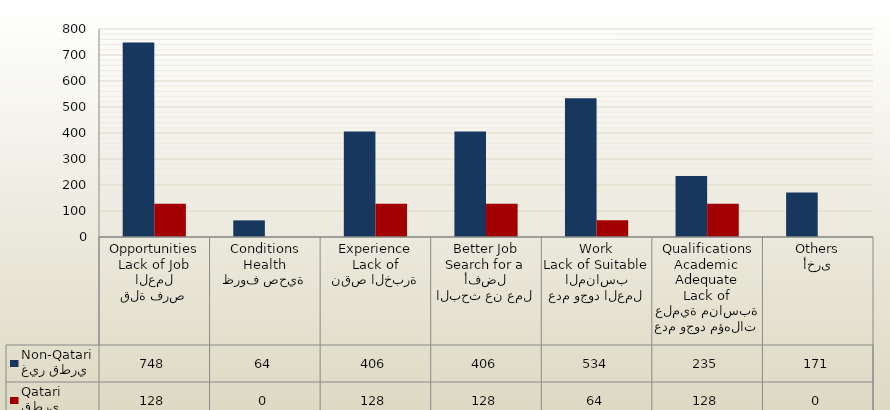
| Category | غير قطري
Non-Qatari | قطري
Qatari |
|---|---|---|
| قلة فرص العمل
Lack of Job Opportunities | 748 | 128 |
| ظروف صحية
Health Conditions | 64 | 0 |
| نقص الخبرة
Lack of Experience | 406 | 128 |
| البحث عن عمل أفضل
Search for a Better Job | 406 | 128 |
| عدم وجود العمل المناسب
Lack of Suitable Work | 534 | 64 |
| عدم وجود مؤهلات علمية مناسبة
Lack of Adequate Academic Qualifications | 235 | 128 |
| أخرى
Others | 171 | 0 |